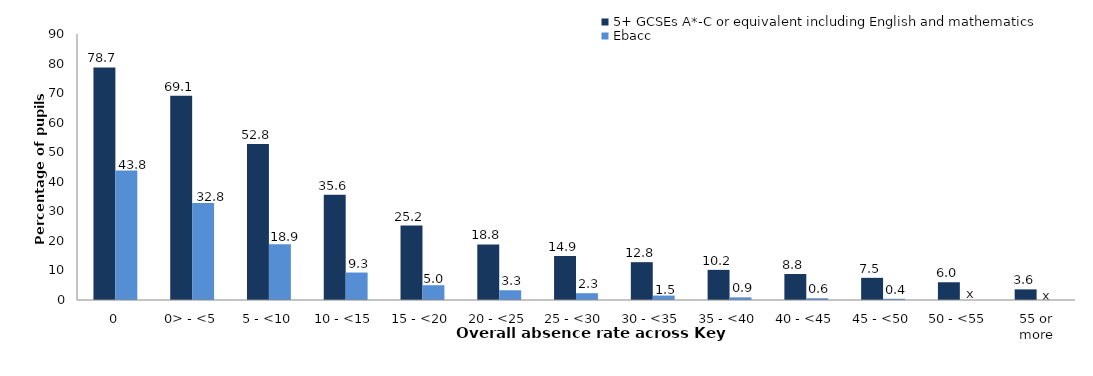
| Category | 5+ GCSEs A*-C or equivalent including English and mathematics | Ebacc |
|---|---|---|
| 0 | 78.7 | 43.8 |
| 0> - <5 | 69.1 | 32.8 |
| 5 - <10 | 52.8 | 18.9 |
| 10 - <15 | 35.6 | 9.3 |
| 15 - <20 | 25.2 | 5 |
| 20 - <25 | 18.8 | 3.3 |
| 25 - <30 | 14.9 | 2.3 |
| 30 - <35 | 12.8 | 1.5 |
| 35 - <40 | 10.2 | 0.9 |
| 40 - <45 | 8.8 | 0.6 |
| 45 - <50 | 7.5 | 0.4 |
| 50 - <55 | 6 | 0 |
| 55 or more | 3.6 | 0 |